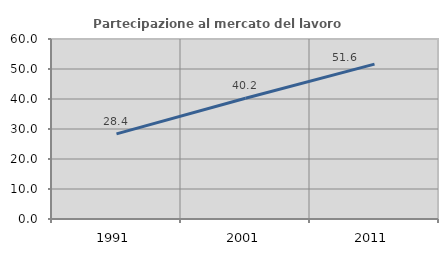
| Category | Partecipazione al mercato del lavoro  femminile |
|---|---|
| 1991.0 | 28.39 |
| 2001.0 | 40.23 |
| 2011.0 | 51.613 |